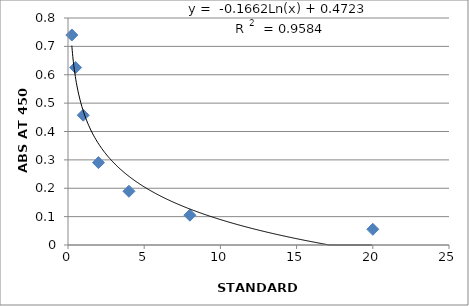
| Category | Series 0 |
|---|---|
| 20.0 | 0.055 |
| 8.0 | 0.105 |
| 4.0 | 0.189 |
| 2.0 | 0.29 |
| 1.0 | 0.457 |
| 0.5 | 0.625 |
| 0.25 | 0.74 |